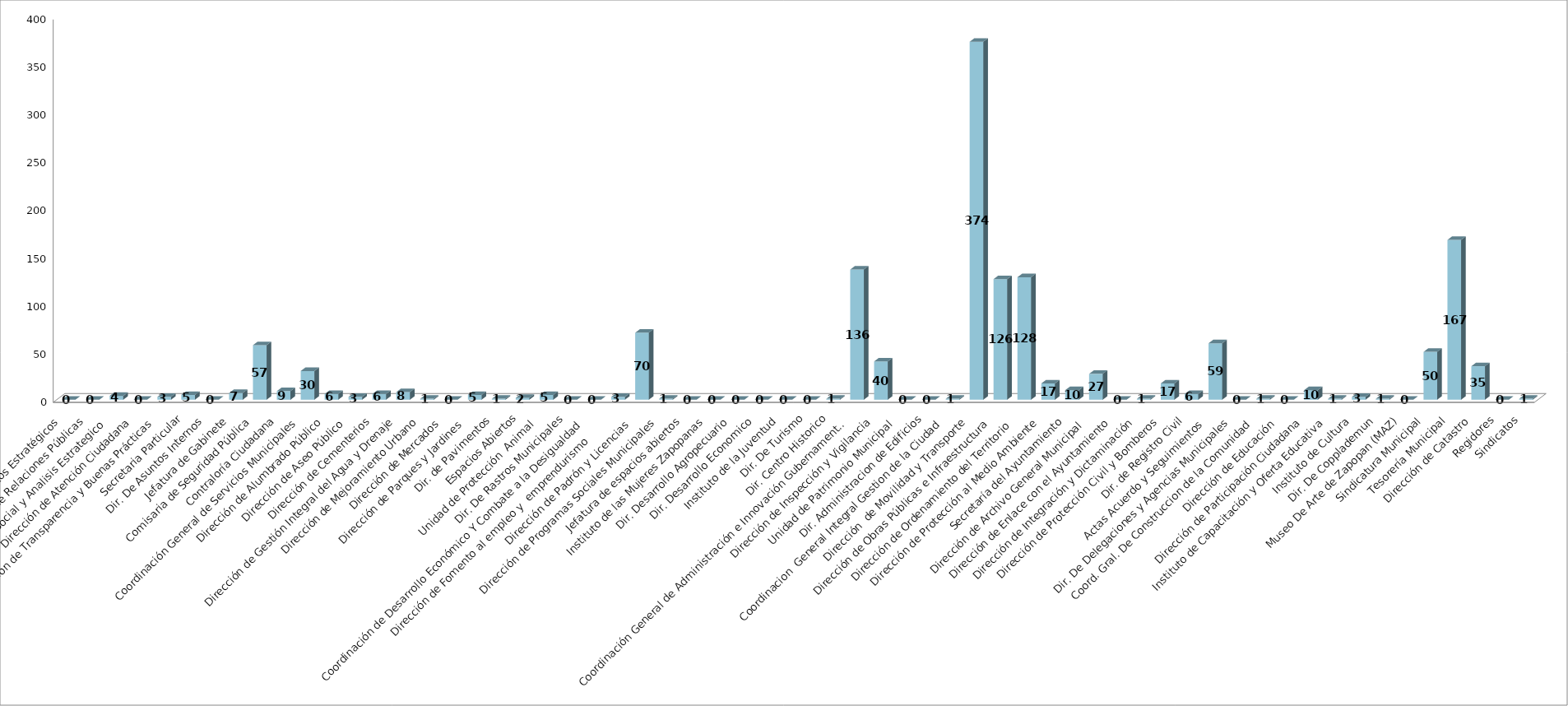
| Category | Series 0 | Series 1 |
|---|---|---|
| Area de Proyectos Estratégicos |  | 0 |
| Área de Relaciones Públicas |  | 0 |
| Comunicación Social y Analisis Estrategico  |  | 4 |
| Dirección de Atención Ciudadana |  | 0 |
| Dirección de Transparencia y Buenas Prácticas |  | 3 |
| Secretaria Particular |  | 5 |
| Dir. De Asuntos Internos |  | 0 |
| Jefatura de Gabinete |  | 7 |
| Comisaria de Seguridad Pública |  | 57 |
| Contraloría Ciudadana |  | 9 |
| Coordinación General de Servicios Municipales |  | 30 |
| Dirección de Alumbrado Público |  | 6 |
| Dirección de Aseo Público  |  | 3 |
| Dirección de Cementerios |  | 6 |
| Dirección de Gestión Integral del Agua y Drenaje |  | 8 |
| Dirección de Mejoramiento Urbano |  | 1 |
| Dirección de Mercados  |  | 0 |
| Dirección de Parques y Jardines  |  | 5 |
| Dir. de Pavimentos |  | 1 |
| Espacios Abiertos |  | 2 |
| Unidad de Protección  Animal  |  | 5 |
| Dir. De Rastros Municipales |  | 0 |
| Coordinación de Desarrollo Económico Y Combate a la Desigualdad |  | 0 |
| Dirección de Fomento al empleo y  emprendurismo         |  | 3 |
| Dirección de Padrón y Licencias  |  | 70 |
| Dirección de Programas Sociales Municipales |  | 1 |
| Jefatura de espacios abiertos |  | 0 |
| Instituto de las Mujeres Zapopanas |  | 0 |
|  Dir. Desarrollo Agropecuario |  | 0 |
| Dir. Desarrollo Economico |  | 0 |
| Instituto de la Juventud |  | 0 |
| Dir. De Turismo |  | 0 |
| Dir. Centro Historico |  | 1 |
| Coordinación General de Administración e Innovación Gubernamental |  | 136 |
| Dirección de Inspección y Vigilancia |  | 40 |
| Unidad de Patrimonio Municipal  |  | 0 |
| Dir. Administracion de Edificios |  | 0 |
| Coordinacion  General Integral Gestion de la Ciudad |  | 1 |
| Dirección  de Movilidad y Transporte |  | 374 |
| Dirección de Obras Públicas e Infraestructura |  | 126 |
| Dirección de Ordenamiento del Territorio  |  | 128 |
| Dirección de Protección al Medio Ambiente  |  | 17 |
| Secretaría del Ayuntamiento |  | 10 |
| Dirección de Archivo General Municipal  |  | 27 |
| Dirección de Enlace con el Ayuntamiento |  | 0 |
| Dirección de Integración y Dictaminación |  | 1 |
| Dirección de Protección Civil y Bomberos |  | 17 |
| Dir. de Registro Civil |  | 6 |
| Actas Acuerdo y Seguimientos  |  | 59 |
| Dir. De Delegaciones y Agencias Municipales |  | 0 |
| Coord. Gral. De Construccion de la Comunidad |  | 1 |
| Dirección de Educación  |  | 0 |
| Dirección de Participación Ciudadana |  | 10 |
| Instituto de Capacitación y Oferta Educativa |  | 1 |
| Instituto de Cultura  |  | 3 |
| Dir. De Copplademun |  | 1 |
| Museo De Arte de Zapopan (MAZ) |  | 0 |
| Sindicatura Municipal |  | 50 |
| Tesorería Municipal |  | 167 |
| Dirección de Catastro |  | 35 |
| Regidores |  | 0 |
| Sindicatos |  | 1 |